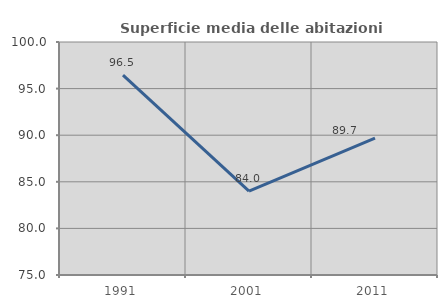
| Category | Superficie media delle abitazioni occupate |
|---|---|
| 1991.0 | 96.451 |
| 2001.0 | 84.007 |
| 2011.0 | 89.681 |